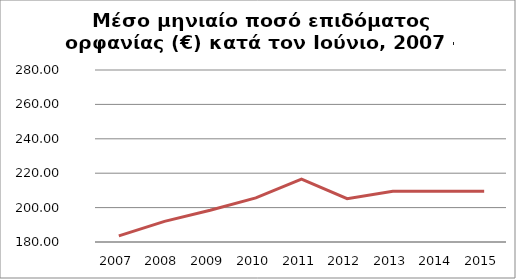
| Category | Series 1 |
|---|---|
| 2007.0 | 183.548 |
| 2008.0 | 192.013 |
| 2009.0 | 198.475 |
| 2010.0 | 205.65 |
| 2011.0 | 216.535 |
| 2012.0 | 205.197 |
| 2013.0 | 209.55 |
| 2014.0 | 209.519 |
| 2015.0 | 209.554 |